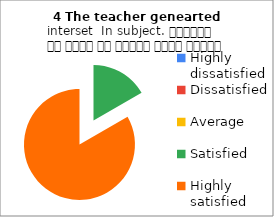
| Category | 4 The teacher genearted interset  In subject. शिक्षक ने विषय के प्रति रुचि जागृत की |
|---|---|
| Highly dissatisfied | 0 |
| Dissatisfied | 0 |
| Average | 0 |
| Satisfied | 1 |
| Highly satisfied | 5 |